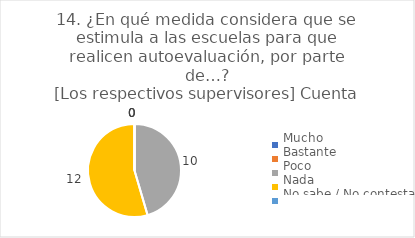
| Category | 14. ¿En qué medida considera que se estimula a las escuelas para que realicen autoevaluación, por parte de…?
[Los respectivos supervisores] |
|---|---|
| Mucho  | 0 |
| Bastante  | 0 |
| Poco  | 0.455 |
| Nada  | 0.545 |
| No sabe / No contesta | 0 |